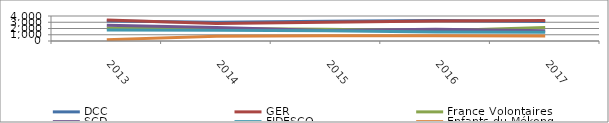
| Category | DCC | GER | France Volontaires | SCD | FIDESCO | Enfants du Mékong |
|---|---|---|---|---|---|---|
| 2013.0 | 3201 | 3342 | 2094 | 2531 | 1774 | 217 |
| 2014.0 | 3016 | 2818 | 1989 | 2144 | 1700 | 745 |
| 2015.0 | 3162 | 3016 | 1891 | 1693 | 1659 | 842 |
| 2016.0 | 3283 | 3204 | 1653 | 1893 | 1430 | 829 |
| 2017.0 | 3135 | 3269 | 2150 | 1630 | 1401 | 784 |